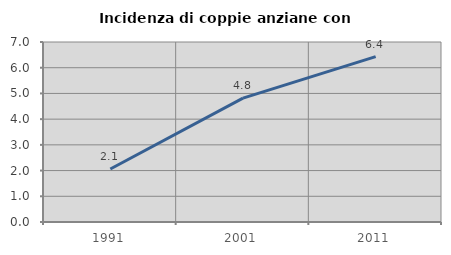
| Category | Incidenza di coppie anziane con figli |
|---|---|
| 1991.0 | 2.062 |
| 2001.0 | 4.817 |
| 2011.0 | 6.432 |